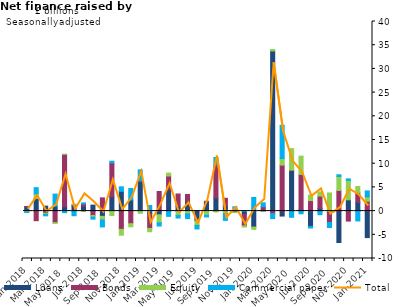
| Category | Loans | Bonds | Equity | Commercial paper |
|---|---|---|---|---|
| Jan-2018 | 0.875 | 0.093 | -0.169 | -0.116 |
| Feb-2018 | 2.654 | -2.027 | 0.982 | 1.309 |
| Mar-2018 | 1.045 | -0.433 | -0.213 | -0.357 |
| Apr-2018 | 1.059 | -2.435 | -0.156 | 2.532 |
| May-2018 | 0.928 | 11.031 | 0.047 | -0.33 |
| Jun-2018 | 1.054 | 0.294 | 0.108 | -0.977 |
| Jul-2018 | 1.011 | 0.494 | -0.044 | 0.233 |
| Aug-2018 | 1.262 | -0.932 | -0.333 | -0.431 |
| Sep-2018 | -1.108 | 2.795 | -0.747 | -1.484 |
| Oct-2018 | 3.029 | 7.138 | -0.945 | 0.363 |
| Nov-2018 | 4.165 | -3.846 | -1.238 | 0.958 |
| Dec-2018 | 2.35 | -2.65 | -0.673 | 2.407 |
| Jan-2019 | 6.224 | 0.161 | -0.468 | 2.312 |
| Feb-2019 | -0.563 | -3.084 | -0.709 | 1.181 |
| Mar-2019 | -0.775 | 4.131 | -1.689 | -0.683 |
| Apr-2019 | 4.488 | 2.92 | 0.615 | -1.109 |
| May-2019 | 0.991 | 2.622 | -0.901 | -0.561 |
| Jun-2019 | 2.074 | 1.437 | -0.583 | -1.001 |
| Jul-2019 | -1.809 | -0.281 | -0.932 | -0.742 |
| Aug-2019 | 1.902 | 0.174 | -0.877 | -0.357 |
| Sep-2019 | 2.777 | 6.981 | -0.176 | 1.548 |
| Oct-2019 | 1.051 | 1.651 | -0.54 | -1.416 |
| Nov-2019 | 0.254 | -0.195 | -0.117 | 0.654 |
| Dec-2019 | -0.693 | -2.415 | -0.249 | 0.031 |
| Jan-2020 | -3.368 | 0.155 | -0.503 | 2.731 |
| Feb-2020 | 0.156 | 0.764 | -0.037 | 0.826 |
| Mar-2020 | 33.79 | -0.54 | 0.307 | -1.041 |
| Apr-2020 | -1.048 | 9.698 | 1.392 | 7.014 |
| May-2020 | 8.526 | 0.131 | 4.523 | -1.303 |
| Jun-2020 | 0.246 | 7.494 | 3.856 | -0.564 |
| Jul-2020 | -3.226 | 2.212 | 1.172 | -0.34 |
| Aug-2020 | 0.545 | 2.614 | 0.896 | -0.762 |
| Sep-2020 | -0.28 | -2.122 | 3.828 | -1.058 |
| Oct-2020 | -6.621 | 4.349 | 2.946 | 0.366 |
| Nov-2020 | 2.387 | -2.106 | 4.082 | 0.327 |
| Dec-2020 | 1.833 | 2.015 | 1.35 | -2.076 |
| Jan-2021 | -5.587 | 2.081 | 0.91 | 1.265 |